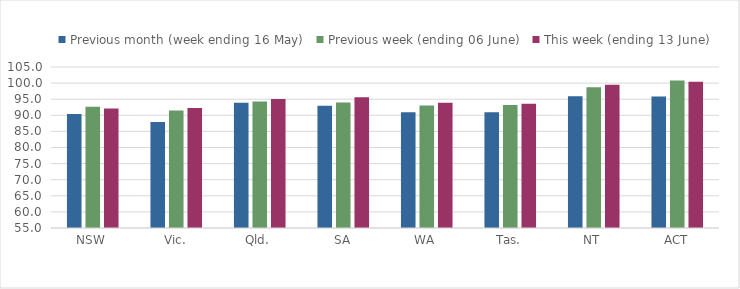
| Category | Previous month (week ending 16 May) | Previous week (ending 06 June) | This week (ending 13 June) |
|---|---|---|---|
| NSW | 90.41 | 92.626 | 92.099 |
| Vic. | 87.955 | 91.459 | 92.303 |
| Qld. | 93.927 | 94.315 | 95.074 |
| SA | 92.985 | 93.944 | 95.612 |
| WA | 90.935 | 93.039 | 93.898 |
| Tas. | 90.914 | 93.172 | 93.614 |
| NT | 95.89 | 98.739 | 99.475 |
| ACT | 95.839 | 100.772 | 100.392 |